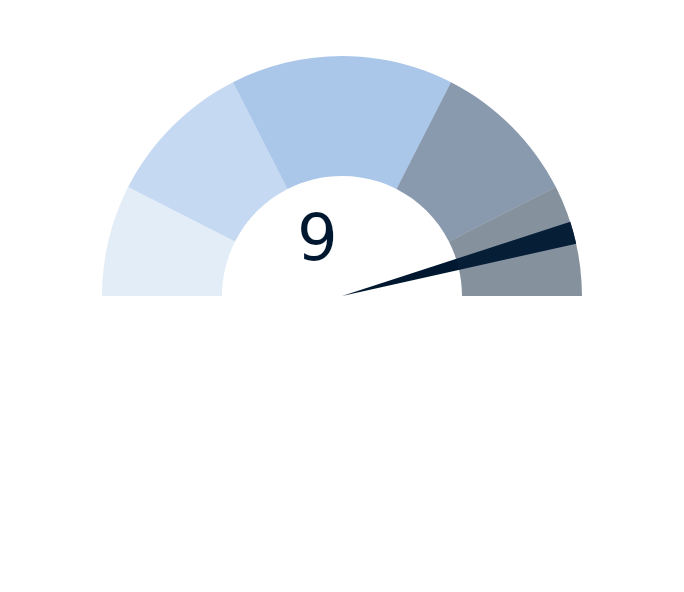
| Category | Series 2 |
|---|---|
| 0 | 9 |
| 1 | 0.3 |
| 2 | 10.7 |